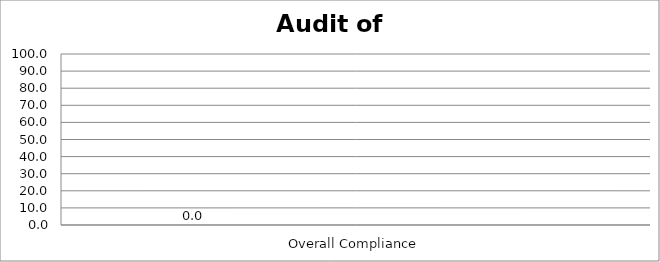
| Category | Series 0 | Series 1 | Series 2 | Series 3 |
|---|---|---|---|---|
| Overall Compliance | 0 |  |  |  |